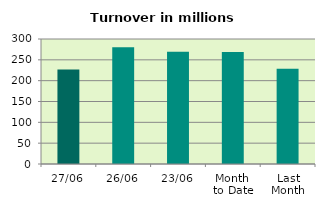
| Category | Series 0 |
|---|---|
| 27/06 | 226.964 |
| 26/06 | 280.009 |
| 23/06 | 269.214 |
| Month 
to Date | 268.99 |
| Last
Month | 228.645 |